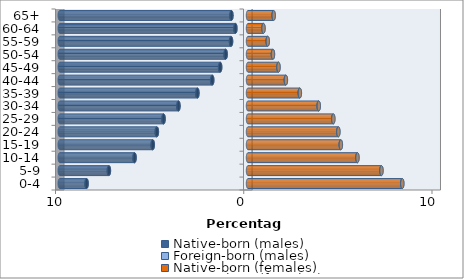
| Category | Native-born (males) | Foreign-born (males) | Native-born (females) | Foreign-born (females) |
|---|---|---|---|---|
| 0-4 | -8.573 | -0.009 | 8.191 | 0.007 |
| 5-9 | -7.389 | -0.008 | 7.085 | 0.007 |
| 10-14 | -6.025 | -0.01 | 5.809 | 0.008 |
| 15-19 | -5.059 | -0.013 | 4.925 | 0.01 |
| 20-24 | -4.839 | -0.015 | 4.793 | 0.011 |
| 25-29 | -4.484 | -0.015 | 4.524 | 0.012 |
| 30-34 | -3.693 | -0.014 | 3.75 | 0.012 |
| 35-39 | -2.686 | -0.012 | 2.746 | 0.01 |
| 40-44 | -1.899 | -0.01 | 2.007 | 0.009 |
| 45-49 | -1.478 | -0.008 | 1.614 | 0.007 |
| 50-54 | -1.186 | -0.007 | 1.322 | 0.006 |
| 55-59 | -0.9 | -0.005 | 1.044 | 0.005 |
| 60-64 | -0.668 | -0.005 | 0.82 | 0.004 |
| 65+ | -0.88 | -0.005 | 1.359 | 0.005 |